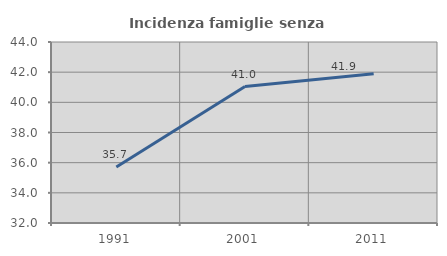
| Category | Incidenza famiglie senza nuclei |
|---|---|
| 1991.0 | 35.714 |
| 2001.0 | 41.045 |
| 2011.0 | 41.892 |